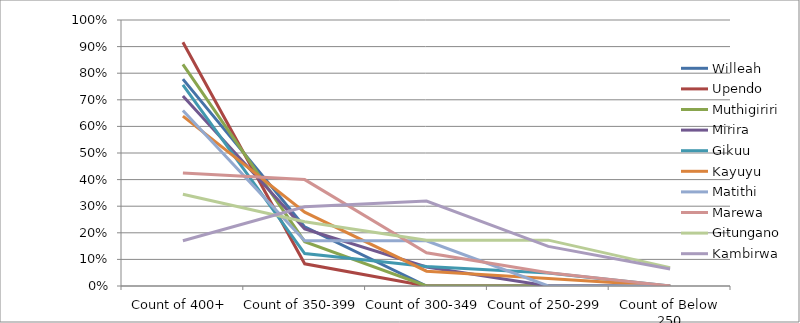
| Category | Willeah | Upendo | Muthigiriri | Mirira | Gikuu | Kayuyu | Matithi | Marewa | Gitungano | Kambirwa |
|---|---|---|---|---|---|---|---|---|---|---|
| Count of 400+ | 0.778 | 0.917 | 0.833 | 0.714 | 0.756 | 0.639 | 0.66 | 0.425 | 0.345 | 0.17 |
| Count of 350-399 | 0.222 | 0.083 | 0.167 | 0.214 | 0.122 | 0.278 | 0.17 | 0.4 | 0.241 | 0.298 |
| Count of 300-349 | 0 | 0 | 0 | 0.071 | 0.073 | 0.056 | 0.17 | 0.125 | 0.172 | 0.319 |
| Count of 250-299 | 0 | 0 | 0 | 0 | 0.049 | 0.028 | 0 | 0.05 | 0.172 | 0.149 |
| Count of Below 250 | 0 | 0 | 0 | 0 | 0 | 0 | 0 | 0 | 0.069 | 0.064 |